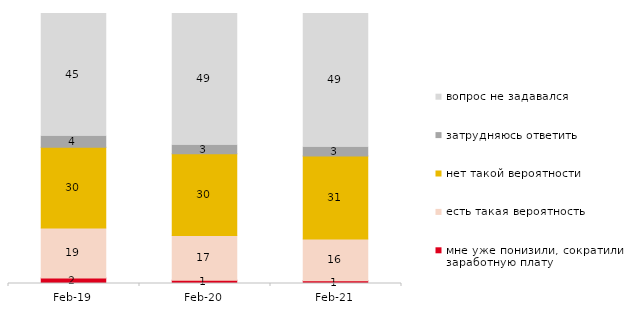
| Category | мне уже понизили, сократили заработную плату | есть такая вероятность | нет такой вероятности | затрудняюсь ответить | вопрос не задавался |
|---|---|---|---|---|---|
| 2019-02-01 | 2.05 | 18.55 | 29.85 | 4.2 | 45.35 |
| 2020-02-01 | 1.188 | 16.584 | 30.297 | 3.267 | 48.663 |
| 2021-02-01 | 0.993 | 15.533 | 30.72 | 3.275 | 49.479 |